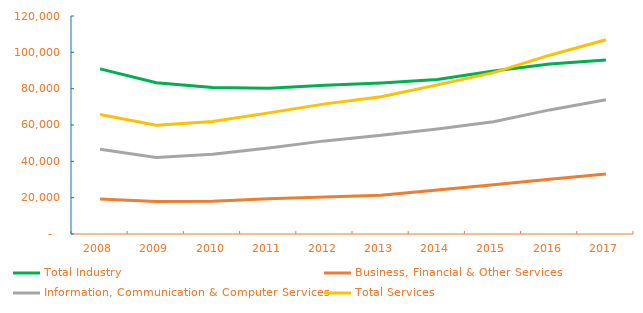
| Category | Total Industry | Business, Financial & Other Services | Information, Communication & Computer Services | Total Services |
|---|---|---|---|---|
| 2008.0 | 90886 | 19223 | 46609 | 65832 |
| 2009.0 | 83282 | 17856 | 42057 | 59913 |
| 2010.0 | 80612 | 17989 | 43884 | 61873 |
| 2011.0 | 80169 | 19355 | 47322 | 66677 |
| 2012.0 | 81911 | 20372 | 51257 | 71629 |
| 2013.0 | 83143 | 21272 | 54316 | 75588 |
| 2014.0 | 85030 | 24230 | 57841 | 82071 |
| 2015.0 | 89696 | 27087 | 61761 | 88848 |
| 2016.0 | 93533 | 30121 | 68310 | 98431 |
| 2017.0 | 95783 | 32997 | 73923 | 106920 |